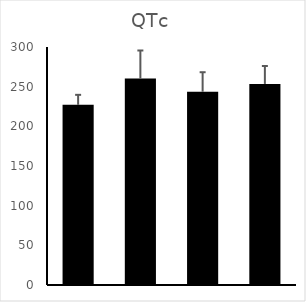
| Category | QTc |
|---|---|
| 0 | 227.067 |
| 1 | 260.213 |
| 2 | 243.596 |
| 3 | 253.438 |